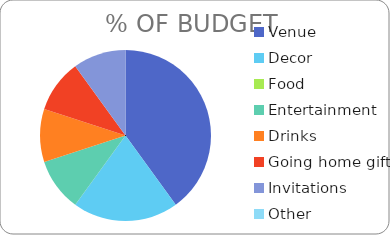
| Category | % OF BUDGET |
|---|---|
| Venue | 0.667 |
| Decor | 0.333 |
| Food | 0 |
| Entertainment | 0.167 |
| Drinks | 0.167 |
| Going home gifts | 0.167 |
| Invitations | 0.167 |
| Other | 0 |